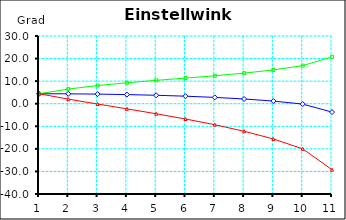
| Category | Gleitflug | Aufschlag | Abschlag |
|---|---|---|---|
| 0 | 4.421 | 4.419 | 4.421 |
| 1 | 4.38 | 6.486 | 2.033 |
| 2 | 4.257 | 8.035 | -0.143 |
| 3 | 4.047 | 9.281 | -2.272 |
| 4 | 3.743 | 10.354 | -4.451 |
| 5 | 3.332 | 11.356 | -6.768 |
| 6 | 2.796 | 12.386 | -9.312 |
| 7 | 2.098 | 13.546 | -12.201 |
| 8 | 1.17 | 14.966 | -15.62 |
| 9 | -0.163 | 16.872 | -19.993 |
| 10 | -3.706 | 20.762 | -29.242 |